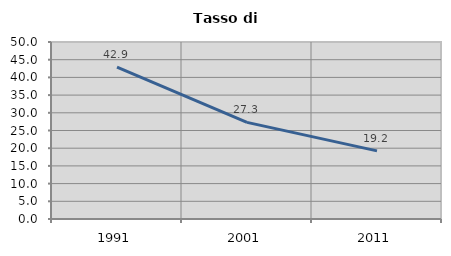
| Category | Tasso di disoccupazione   |
|---|---|
| 1991.0 | 42.931 |
| 2001.0 | 27.303 |
| 2011.0 | 19.238 |